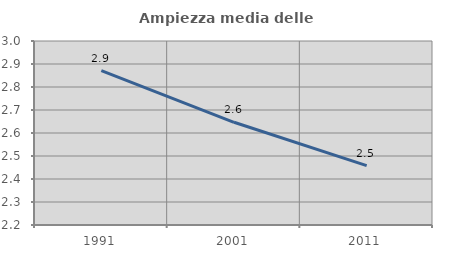
| Category | Ampiezza media delle famiglie |
|---|---|
| 1991.0 | 2.871 |
| 2001.0 | 2.647 |
| 2011.0 | 2.458 |